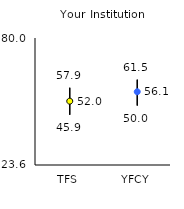
| Category | 25th | 75th | Mean |
|---|---|---|---|
| TFS | 45.9 | 57.9 | 51.95 |
| YFCY | 50 | 61.5 | 56.13 |